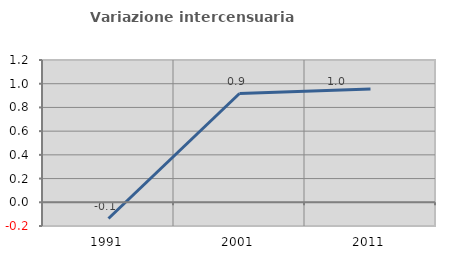
| Category | Variazione intercensuaria annua |
|---|---|
| 1991.0 | -0.137 |
| 2001.0 | 0.917 |
| 2011.0 | 0.956 |